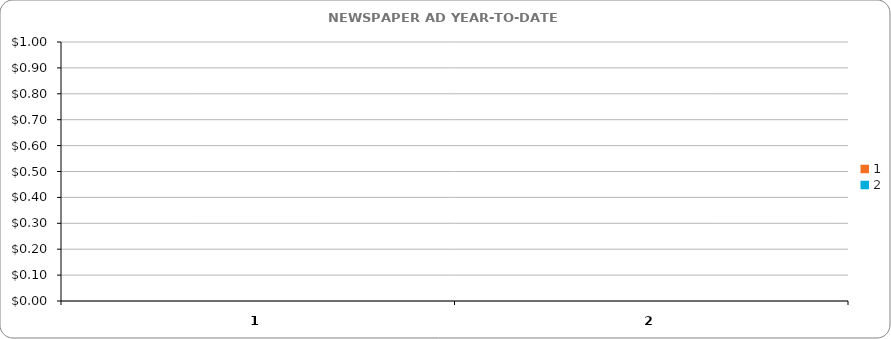
| Category | GEORGETOWN TIMES |
|---|---|
| 0 | 0 |
| 1 | 0 |